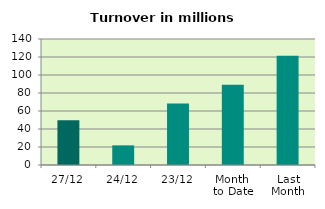
| Category | Series 0 |
|---|---|
| 27/12 | 49.71 |
| 24/12 | 21.815 |
| 23/12 | 68.371 |
| Month 
to Date | 89.175 |
| Last
Month | 121.455 |